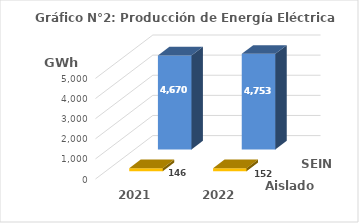
| Category | Aislados | SEIN |
|---|---|---|
| 2021.0 | 145.55 | 4670.403 |
| 2022.0 | 152.141 | 4753.271 |